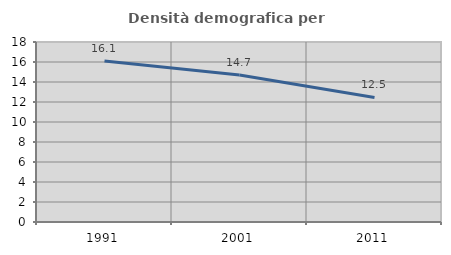
| Category | Densità demografica |
|---|---|
| 1991.0 | 16.105 |
| 2001.0 | 14.702 |
| 2011.0 | 12.45 |